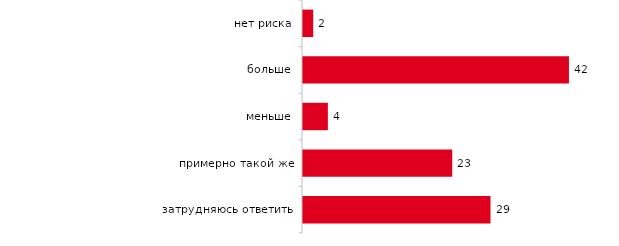
| Category | Series 0 |
|---|---|
| нет риска | 1.6 |
| больше | 41.7 |
| меньше | 3.9 |
| примерно такой же | 23.4 |
| затрудняюсь ответить | 29.4 |